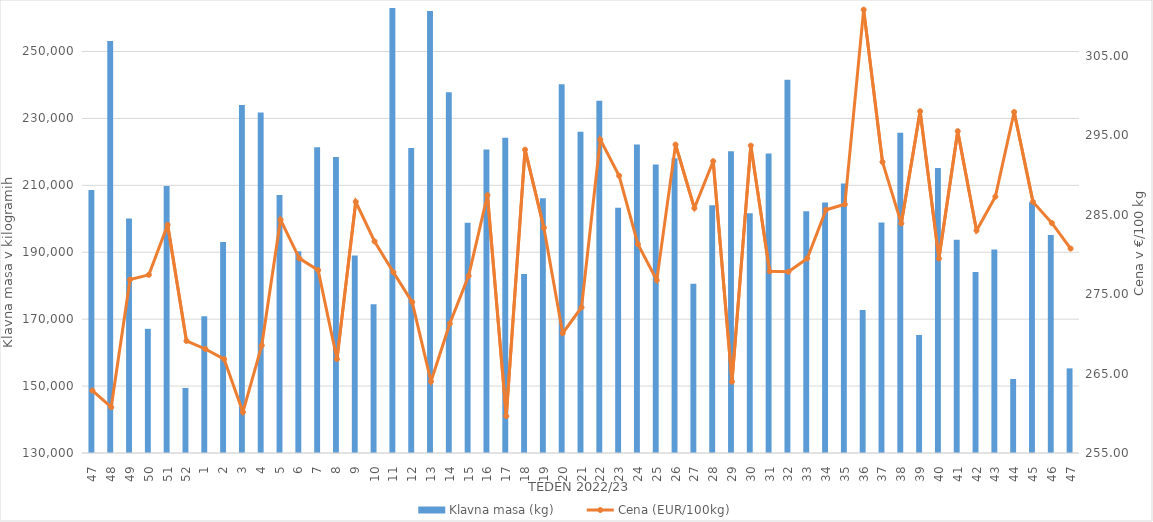
| Category | Klavna masa (kg) |
|---|---|
| 47.0 | 208597 |
| 48.0 | 253151 |
| 49.0 | 200117 |
| 50.0 | 167119 |
| 51.0 | 209797 |
| 52.0 | 149439 |
| 1.0 | 170843 |
| 2.0 | 193093 |
| 3.0 | 234042 |
| 4.0 | 231737 |
| 5.0 | 207136 |
| 6.0 | 190311 |
| 7.0 | 221366 |
| 8.0 | 218470 |
| 9.0 | 189006 |
| 10.0 | 174425 |
| 11.0 | 265476 |
| 12.0 | 221171 |
| 13.0 | 262102 |
| 14.0 | 237813 |
| 15.0 | 198828 |
| 16.0 | 220686 |
| 17.0 | 224192 |
| 18.0 | 183508 |
| 19.0 | 206133 |
| 20.0 | 240223 |
| 21.0 | 226050 |
| 22.0 | 235273 |
| 23.0 | 203306 |
| 24.0 | 222178 |
| 25.0 | 216259 |
| 26.0 | 218064 |
| 27.0 | 180556 |
| 28.0 | 204078 |
| 29.0 | 220162 |
| 30.0 | 201649 |
| 31.0 | 219538 |
| 32.0 | 241549 |
| 33.0 | 202261 |
| 34.0 | 204903 |
| 35.0 | 210575 |
| 36.0 | 172745 |
| 37.0 | 198877 |
| 38.0 | 225730 |
| 39.0 | 165273 |
| 40.0 | 215175 |
| 41.0 | 193769 |
| 42.0 | 184122 |
| 43.0 | 190834 |
| 44.0 | 152119 |
| 45.0 | 204974 |
| 46.0 | 195179 |
| 47.0 | 155300 |